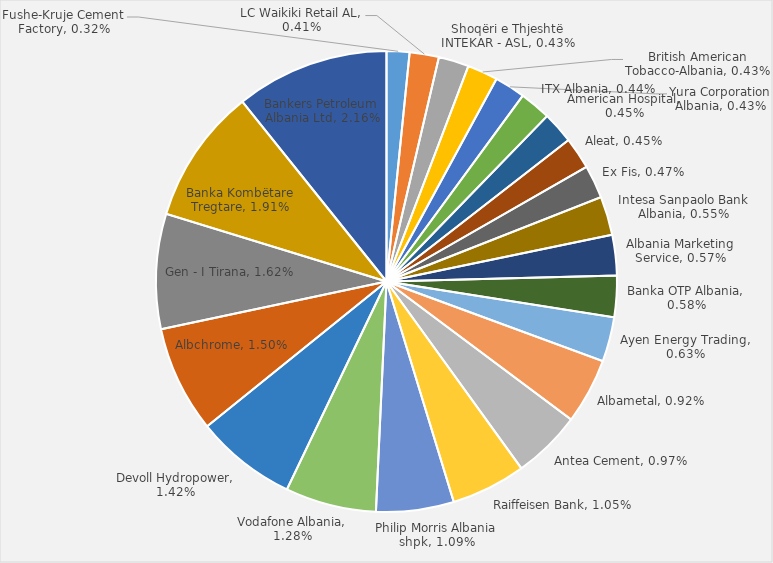
| Category | Pesha ndaj  Xhiros Total të 100 Kompanive më të Mëdha |
|---|---|
| Fushe-Kruje Cement Factory | 0.003 |
| LC Waikiki Retail AL | 0.004 |
| Shoqëri e Thjeshtë INTEKAR - ASL | 0.004 |
| British American Tobacco-Albania | 0.004 |
| Yura Corporation Albania | 0.004 |
| ITX Albania | 0.004 |
| American Hospital | 0.004 |
| Aleat | 0.004 |
| Ex Fis | 0.005 |
| Intesa Sanpaolo Bank Albania | 0.005 |
| Albania Marketing Service | 0.006 |
| Banka OTP Albania | 0.006 |
| Ayen Energy Trading | 0.006 |
| Albametal | 0.009 |
| Antea Cement | 0.01 |
| Raiffeisen Bank | 0.011 |
| Philip Morris Albania shpk | 0.011 |
| Vodafone Albania | 0.013 |
| Devoll Hydropower | 0.014 |
| Albchrome | 0.015 |
| Gen - I Tirana | 0.016 |
| Banka Kombëtare Tregtare | 0.019 |
| Bankers Petroleum Albania Ltd | 0.022 |